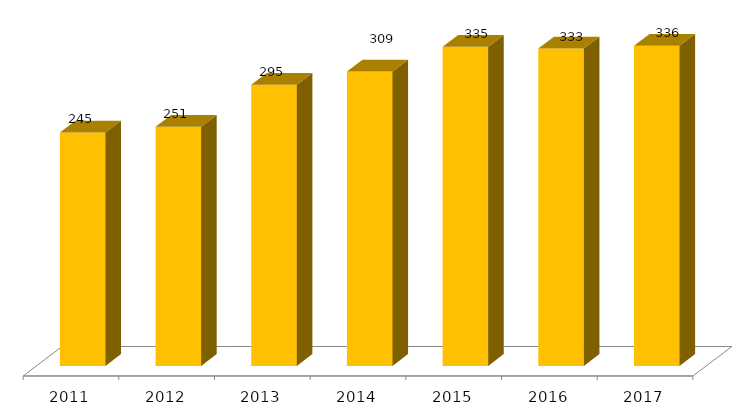
| Category | Categoria/Ano |
|---|---|
| 2011.0 | 245 |
| 2012.0 | 251 |
| 2013.0 | 295 |
| 2014.0 | 309 |
| 2015.0 | 335 |
| 2016.0 | 333 |
| 2017.0 | 336 |